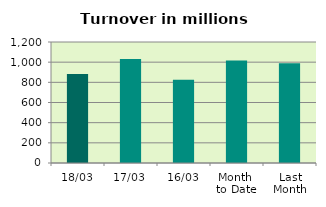
| Category | Series 0 |
|---|---|
| 18/03 | 883.143 |
| 17/03 | 1032.086 |
| 16/03 | 826.265 |
| Month 
to Date | 1016.293 |
| Last
Month | 989.924 |